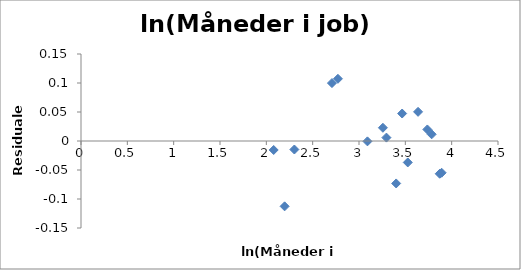
| Category | Series 0 |
|---|---|
| 2.0794415416798357 | -0.016 |
| 2.1972245773362196 | -0.113 |
| 2.302585092994046 | -0.015 |
| 2.70805020110221 | 0.1 |
| 2.772588722239781 | 0.107 |
| 3.091042453358316 | -0.001 |
| 3.295836866004329 | 0.006 |
| 3.258096538021482 | 0.023 |
| 3.4011973816621555 | -0.073 |
| 3.5263605246161616 | -0.037 |
| 3.4657359027997265 | 0.047 |
| 3.6375861597263857 | 0.05 |
| 3.7376696182833684 | 0.02 |
| 3.784189633918261 | 0.012 |
| 3.871201010907891 | -0.056 |
| 3.8918202981106265 | -0.055 |